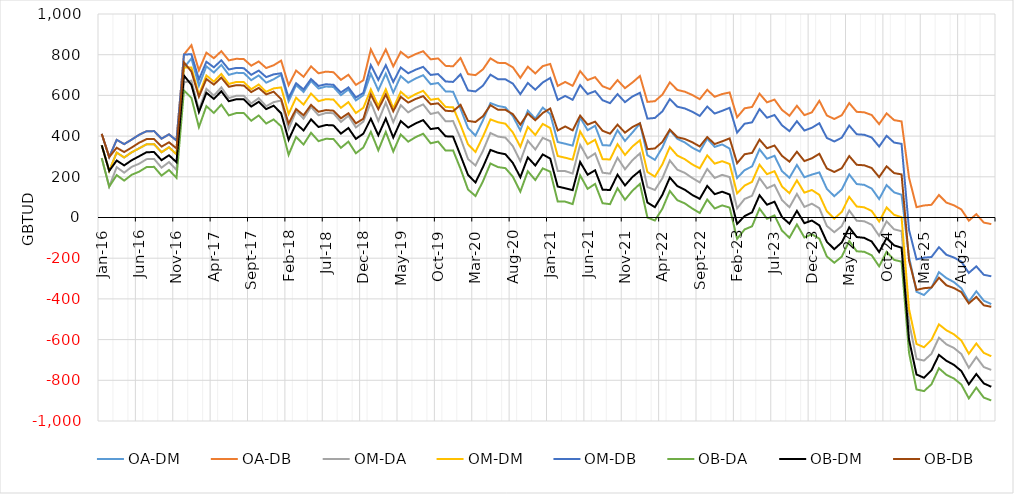
| Category | OA-DM | OA-DB | OM-DA | OM-DM | OM-DB | OB-DA | OB-DM | OB-DB |
|---|---|---|---|---|---|---|---|---|
| 2016-01-01 | 354.959 | 410.766 | 292.027 | 354.959 | 410.766 | 292.027 | 354.959 | 410.766 |
| 2016-02-01 | 228.96 | 296.916 | 151.496 | 228.96 | 296.916 | 151.496 | 228.96 | 296.916 |
| 2016-03-01 | 319.046 | 381.736 | 247.573 | 319.046 | 381.736 | 208.573 | 280.046 | 342.736 |
| 2016-04-01 | 294.964 | 360.67 | 220.139 | 294.964 | 360.67 | 181.139 | 255.964 | 321.67 |
| 2016-05-01 | 320.138 | 382.748 | 248.801 | 320.138 | 382.748 | 209.801 | 281.138 | 343.748 |
| 2016-06-01 | 339.799 | 406.345 | 264.109 | 339.799 | 406.345 | 225.109 | 300.799 | 367.345 |
| 2016-07-01 | 359.889 | 424.197 | 286.762 | 359.889 | 424.197 | 247.762 | 320.889 | 385.197 |
| 2016-08-01 | 360.58 | 424.486 | 287.902 | 360.58 | 424.486 | 248.902 | 321.58 | 385.486 |
| 2016-09-01 | 320.69 | 387.341 | 244.842 | 320.69 | 387.341 | 205.842 | 281.69 | 348.341 |
| 2016-10-01 | 344.902 | 408.604 | 272.368 | 344.902 | 408.604 | 233.368 | 305.902 | 369.604 |
| 2016-11-01 | 310.767 | 378.404 | 233.945 | 310.767 | 378.404 | 194.945 | 271.767 | 339.404 |
| 2016-12-01 | 736.603 | 801.105 | 663.185 | 736.603 | 801.105 | 624.185 | 697.603 | 762.105 |
| 2017-01-01 | 781.406 | 846.772 | 672.55 | 736.63 | 801.995 | 587.55 | 651.63 | 716.995 |
| 2017-02-01 | 647.82 | 723.377 | 528.919 | 603.044 | 678.601 | 443.919 | 518.044 | 593.601 |
| 2017-03-01 | 742.81 | 810.007 | 632.149 | 698.033 | 765.231 | 547.149 | 613.033 | 680.231 |
| 2017-04-01 | 712.549 | 782.867 | 598.808 | 667.772 | 738.09 | 513.808 | 582.772 | 653.09 |
| 2017-05-01 | 750.152 | 817.236 | 639.588 | 705.376 | 772.46 | 554.588 | 620.376 | 687.46 |
| 2017-06-01 | 701.08 | 772.022 | 586.722 | 656.303 | 727.245 | 501.722 | 571.303 | 642.245 |
| 2017-07-01 | 710.769 | 779.859 | 598.24 | 665.992 | 735.082 | 513.24 | 580.992 | 650.082 |
| 2017-08-01 | 710.296 | 778.607 | 598.536 | 665.52 | 733.83 | 513.536 | 580.52 | 648.83 |
| 2017-09-01 | 674.884 | 745.946 | 560.41 | 630.107 | 701.17 | 475.41 | 545.107 | 616.17 |
| 2017-10-01 | 698.32 | 766.708 | 586.479 | 653.543 | 721.931 | 501.479 | 568.543 | 636.931 |
| 2017-11-01 | 662.403 | 734.609 | 546.803 | 617.627 | 689.832 | 461.803 | 532.627 | 604.832 |
| 2017-12-01 | 679.223 | 748.11 | 566.894 | 634.446 | 703.333 | 481.894 | 549.446 | 618.333 |
| 2018-01-01 | 701.144 | 770.807 | 574.794 | 639.1 | 708.763 | 447.794 | 512.1 | 581.763 |
| 2018-02-01 | 570.833 | 650.222 | 434.906 | 508.788 | 588.178 | 307.906 | 381.788 | 461.178 |
| 2018-03-01 | 650.697 | 721.956 | 522.774 | 588.653 | 659.911 | 395.774 | 461.653 | 532.911 |
| 2018-04-01 | 616.855 | 691.352 | 485.739 | 554.81 | 629.307 | 358.739 | 427.81 | 502.307 |
| 2018-05-01 | 671.279 | 742.489 | 543.401 | 609.235 | 680.444 | 416.401 | 482.235 | 553.444 |
| 2018-06-01 | 633.727 | 708.525 | 502.312 | 571.683 | 646.481 | 375.312 | 444.683 | 519.481 |
| 2018-07-01 | 643.534 | 716.838 | 513.745 | 581.489 | 654.794 | 386.745 | 454.489 | 527.794 |
| 2018-08-01 | 641.506 | 713.935 | 512.582 | 579.462 | 651.891 | 385.582 | 452.462 | 524.891 |
| 2018-09-01 | 601.208 | 676.4 | 469.564 | 539.164 | 614.356 | 342.564 | 412.164 | 487.356 |
| 2018-10-01 | 628.852 | 701.418 | 499.793 | 566.808 | 639.374 | 372.793 | 439.808 | 512.374 |
| 2018-11-01 | 575.379 | 651.697 | 442.623 | 513.335 | 589.653 | 315.623 | 386.335 | 462.653 |
| 2018-12-01 | 601.072 | 674.35 | 471.312 | 539.028 | 612.305 | 344.312 | 412.028 | 485.305 |
| 2019-01-01 | 706.157 | 825.895 | 565.126 | 629.473 | 749.211 | 421.126 | 485.473 | 605.211 |
| 2019-02-01 | 624.94 | 752.73 | 474.27 | 548.257 | 676.046 | 330.27 | 404.257 | 532.046 |
| 2019-03-01 | 706.787 | 825.567 | 564.489 | 630.104 | 748.884 | 420.489 | 486.104 | 604.884 |
| 2019-04-01 | 613.748 | 742.551 | 468.211 | 537.065 | 665.868 | 324.211 | 393.065 | 521.868 |
| 2019-05-01 | 694.61 | 813.977 | 552.118 | 617.926 | 737.293 | 408.118 | 473.926 | 593.293 |
| 2019-06-01 | 662.731 | 785.388 | 516.664 | 586.048 | 708.704 | 372.664 | 442.048 | 564.704 |
| 2019-07-01 | 683.284 | 803.182 | 539.118 | 606.6 | 726.499 | 395.118 | 462.6 | 582.499 |
| 2019-08-01 | 699.264 | 817.021 | 555.686 | 622.581 | 740.337 | 411.686 | 478.581 | 596.337 |
| 2019-09-01 | 655.049 | 777.237 | 508.598 | 578.365 | 700.554 | 364.598 | 434.365 | 556.554 |
| 2019-10-01 | 660.857 | 781.609 | 517.094 | 584.174 | 704.925 | 373.094 | 440.174 | 560.925 |
| 2019-11-01 | 619.681 | 745.209 | 472.778 | 542.998 | 668.526 | 328.778 | 398.998 | 524.526 |
| 2019-12-01 | 618.076 | 742.88 | 473.807 | 541.393 | 666.197 | 329.807 | 397.393 | 522.197 |
| 2020-01-01 | 534.597 | 783.653 | 389.26 | 454.481 | 703.536 | 239.26 | 304.481 | 553.536 |
| 2020-02-01 | 439.666 | 704.598 | 287.376 | 359.55 | 624.482 | 137.376 | 209.55 | 474.482 |
| 2020-03-01 | 402.264 | 699.452 | 255.564 | 322.147 | 619.336 | 105.564 | 172.147 | 469.336 |
| 2020-04-01 | 477.826 | 728.001 | 327.857 | 397.709 | 647.885 | 177.857 | 247.709 | 497.885 |
| 2020-05-01 | 562.184 | 782.065 | 415.371 | 482.068 | 701.949 | 265.371 | 332.068 | 551.949 |
| 2020-06-01 | 548.303 | 759.944 | 397.742 | 468.187 | 679.827 | 247.742 | 318.187 | 529.827 |
| 2020-07-01 | 541.104 | 759.202 | 392.515 | 460.988 | 679.086 | 242.515 | 310.988 | 529.086 |
| 2020-08-01 | 498.245 | 737.993 | 350.664 | 418.128 | 657.876 | 200.664 | 268.128 | 507.876 |
| 2020-09-01 | 427.711 | 686.253 | 276.961 | 347.595 | 606.137 | 126.961 | 197.595 | 456.137 |
| 2020-10-01 | 525.417 | 741.112 | 377.393 | 445.3 | 660.996 | 227.393 | 295.3 | 510.996 |
| 2020-11-01 | 485.665 | 707.888 | 334.213 | 405.549 | 627.771 | 184.213 | 255.549 | 477.771 |
| 2020-12-01 | 539.983 | 743.856 | 391.447 | 459.866 | 663.74 | 241.447 | 309.866 | 513.74 |
| 2021-01-01 | 508.294 | 754.424 | 375.165 | 439.52 | 685.65 | 225.165 | 289.52 | 535.65 |
| 2021-02-01 | 370.985 | 646.5 | 228.742 | 302.212 | 577.726 | 78.742 | 152.212 | 427.726 |
| 2021-03-01 | 362.48 | 666.196 | 228.013 | 293.706 | 597.422 | 78.013 | 143.706 | 447.422 |
| 2021-04-01 | 353.241 | 647.11 | 215.942 | 284.467 | 578.337 | 65.942 | 134.467 | 428.337 |
| 2021-05-01 | 491.694 | 719.397 | 357.172 | 422.92 | 650.624 | 207.172 | 272.92 | 500.624 |
| 2021-06-01 | 428.962 | 675.237 | 290.82 | 360.188 | 606.463 | 140.82 | 210.188 | 456.463 |
| 2021-07-01 | 450.812 | 689.709 | 314.9 | 382.039 | 620.936 | 164.9 | 232.039 | 470.936 |
| 2021-08-01 | 355.606 | 645.067 | 220.154 | 286.833 | 576.293 | 70.154 | 136.833 | 426.293 |
| 2021-09-01 | 353.814 | 630.553 | 215.535 | 285.04 | 561.779 | 65.535 | 135.04 | 411.779 |
| 2021-10-01 | 429.095 | 674.999 | 293.559 | 360.322 | 606.226 | 143.559 | 210.322 | 456.226 |
| 2021-11-01 | 376.237 | 635.723 | 237.14 | 307.464 | 566.95 | 87.14 | 157.464 | 416.95 |
| 2021-12-01 | 417.862 | 663.473 | 281.624 | 349.089 | 594.699 | 131.624 | 199.089 | 444.699 |
| 2022-01-01 | 461.932 | 695.458 | 315.182 | 379.597 | 613.123 | 165.182 | 229.597 | 463.123 |
| 2022-02-01 | 306.003 | 568.186 | 150.043 | 223.668 | 485.851 | 0.043 | 73.668 | 335.851 |
| 2022-03-01 | 283.105 | 571.514 | 135.136 | 200.77 | 489.179 | -14.864 | 50.77 | 339.179 |
| 2022-04-01 | 343.739 | 603.761 | 192.867 | 261.404 | 521.426 | 42.867 | 111.404 | 371.426 |
| 2022-05-01 | 428.593 | 664.141 | 280.342 | 346.258 | 581.806 | 130.342 | 196.258 | 431.806 |
| 2022-06-01 | 386.731 | 626.868 | 235.113 | 304.397 | 544.533 | 85.113 | 154.397 | 394.533 |
| 2022-07-01 | 368.86 | 618.26 | 219.33 | 286.525 | 535.925 | 69.33 | 136.525 | 385.925 |
| 2022-08-01 | 343.175 | 602.133 | 194.149 | 260.84 | 519.798 | 44.149 | 110.84 | 369.798 |
| 2022-09-01 | 324.037 | 581.507 | 172.226 | 241.702 | 499.172 | 22.226 | 91.702 | 349.172 |
| 2022-10-01 | 387.52 | 627.426 | 238.245 | 305.185 | 545.091 | 88.245 | 155.185 | 395.091 |
| 2022-11-01 | 346.933 | 593.208 | 194.362 | 264.598 | 510.873 | 44.362 | 114.598 | 360.873 |
| 2022-12-01 | 359.095 | 606.586 | 209.536 | 276.76 | 524.251 | 59.536 | 126.76 | 374.251 |
| 2023-01-01 | 338.658 | 614.579 | 198.624 | 262.986 | 538.907 | 48.624 | 112.986 | 388.907 |
| 2023-02-01 | 194.164 | 492.765 | 44.903 | 118.493 | 417.093 | -105.097 | -31.507 | 267.093 |
| 2023-03-01 | 232.557 | 536.438 | 91.168 | 156.885 | 460.766 | -58.832 | 6.885 | 310.766 |
| 2023-04-01 | 251.125 | 543.209 | 106.823 | 175.453 | 467.537 | -43.177 | 25.453 | 317.537 |
| 2023-05-01 | 335.077 | 608.324 | 193.691 | 259.405 | 532.652 | 43.691 | 109.405 | 382.652 |
| 2023-06-01 | 288.483 | 565.913 | 143.655 | 212.811 | 490.241 | -6.345 | 62.811 | 340.241 |
| 2023-07-01 | 303.282 | 579.283 | 160.294 | 227.61 | 503.611 | 10.294 | 77.61 | 353.611 |
| 2023-08-01 | 227.97 | 528.731 | 85.683 | 152.298 | 453.06 | -64.317 | 2.298 | 303.06 |
| 2023-09-01 | 195.287 | 500.03 | 50.419 | 119.615 | 424.358 | -99.581 | -30.385 | 274.358 |
| 2023-10-01 | 258.161 | 548.796 | 115.623 | 182.489 | 473.124 | -34.377 | 32.489 | 323.124 |
| 2023-11-01 | 197.824 | 502.962 | 51.966 | 122.152 | 427.29 | -98.034 | -27.848 | 277.29 |
| 2023-12-01 | 210.813 | 516.644 | 67.882 | 135.141 | 440.972 | -82.118 | -14.859 | 290.972 |
| 2024-01-01 | 221.664 | 573.436 | 45.805 | 111.327 | 463.099 | -104.195 | -38.673 | 313.099 |
| 2024-02-01 | 141.157 | 501.515 | -41.458 | 30.82 | 391.178 | -191.458 | -119.18 | 241.178 |
| 2024-03-01 | 104.776 | 484.044 | -72.251 | -5.561 | 373.707 | -222.251 | -155.561 | 223.707 |
| 2024-04-01 | 137.833 | 502.557 | -42.394 | 27.496 | 392.22 | -192.394 | -122.504 | 242.22 |
| 2024-05-01 | 211.783 | 562.212 | 34.595 | 101.445 | 451.875 | -115.405 | -48.555 | 301.875 |
| 2024-06-01 | 164.402 | 519.319 | -16.022 | 54.065 | 408.982 | -166.022 | -95.935 | 258.982 |
| 2024-07-01 | 160.396 | 516.951 | -18.356 | 50.059 | 406.614 | -168.356 | -99.941 | 256.614 |
| 2024-08-01 | 142.448 | 503.608 | -35.538 | 32.111 | 393.27 | -185.538 | -117.889 | 243.27 |
| 2024-09-01 | 90.683 | 458.881 | -89.932 | -19.655 | 348.544 | -239.932 | -169.655 | 198.544 |
| 2024-10-01 | 159.419 | 511.74 | -18.844 | 49.081 | 401.402 | -168.844 | -100.919 | 251.402 |
| 2024-11-01 | 123.391 | 478.594 | -58.175 | 13.054 | 368.257 | -208.175 | -136.946 | 218.257 |
| 2024-12-01 | 111.805 | 472.138 | -66.994 | 1.467 | 361.801 | -216.994 | -148.533 | 211.801 |
| 2025-01-01 | -193.639 | 195.071 | -514.582 | -450.162 | -61.453 | -664.582 | -600.162 | -211.453 |
| 2025-02-01 | -364.904 | 50.796 | -694.881 | -621.427 | -205.728 | -844.881 | -771.427 | -355.728 |
| 2025-03-01 | -381.058 | 59.174 | -703.139 | -637.582 | -197.35 | -853.139 | -787.582 | -347.35 |
| 2025-04-01 | -344.512 | 62.3 | -669.644 | -601.036 | -194.223 | -819.644 | -751.036 | -344.223 |
| 2025-05-01 | -268.675 | 110.466 | -590.826 | -525.199 | -146.058 | -740.826 | -675.199 | -296.058 |
| 2025-06-01 | -297.629 | 73.286 | -623.2 | -554.153 | -183.238 | -773.2 | -704.153 | -333.238 |
| 2025-07-01 | -317.412 | 59.893 | -641.09 | -573.935 | -196.631 | -791.09 | -723.935 | -346.631 |
| 2025-08-01 | -348.081 | 39.609 | -670.879 | -604.604 | -216.914 | -820.879 | -754.604 | -366.914 |
| 2025-09-01 | -413.052 | -15.694 | -738.866 | -669.576 | -272.218 | -888.866 | -819.576 | -422.218 |
| 2025-10-01 | -362.713 | 16.446 | -685.959 | -619.236 | -240.078 | -835.959 | -769.236 | -390.078 |
| 2025-11-01 | -408.695 | -24.986 | -735.04 | -665.219 | -281.51 | -885.04 | -815.219 | -431.51 |
| 2025-12-01 | -425.326 | -32.319 | -748.961 | -681.849 | -288.843 | -898.961 | -831.849 | -438.843 |